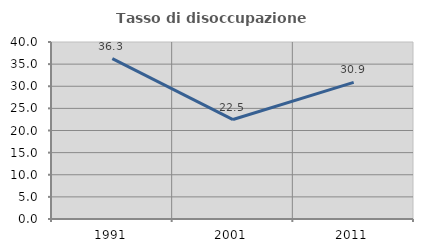
| Category | Tasso di disoccupazione giovanile  |
|---|---|
| 1991.0 | 36.26 |
| 2001.0 | 22.473 |
| 2011.0 | 30.865 |